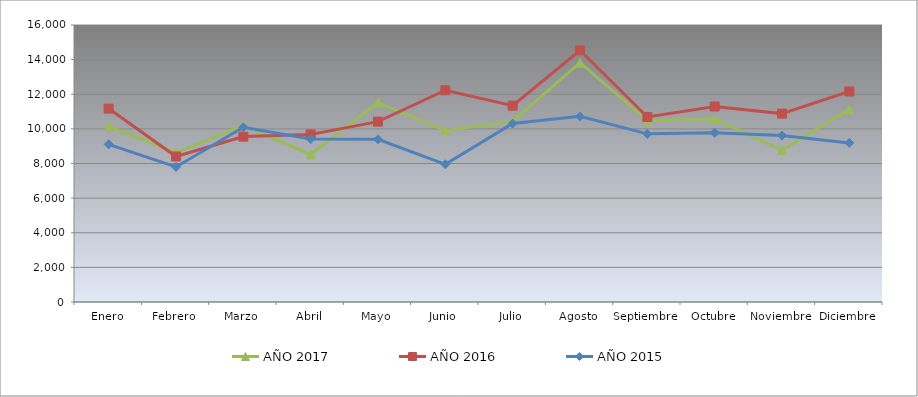
| Category | AÑO 2017 | AÑO 2016 | AÑO 2015 |
|---|---|---|---|
| Enero | 10152.062 | 11174.172 | 9106.519 |
| Febrero | 8626.898 | 8405.009 | 7800.631 |
| Marzo | 10196.154 | 9552.902 | 10091.872 |
| Abril | 8524.686 | 9679.881 | 9413.357 |
| Mayo | 11506.873 | 10418.392 | 9397.833 |
| Junio | 9902.545 | 12231.655 | 7954.05 |
| Julio | 10439.659 | 11338.737 | 10308.302 |
| Agosto | 13822.678 | 14538.614 | 10721.986 |
| Septiembre | 10479.742 | 10687.588 | 9711.977 |
| Octubre | 10573.938 | 11293.025 | 9778.641 |
| Noviembre | 8773.202 | 10881.612 | 9615.177 |
| Diciembre | 11119.069 | 12162.579 | 9190.535 |